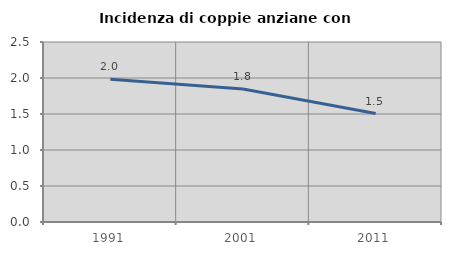
| Category | Incidenza di coppie anziane con figli |
|---|---|
| 1991.0 | 1.982 |
| 2001.0 | 1.848 |
| 2011.0 | 1.507 |